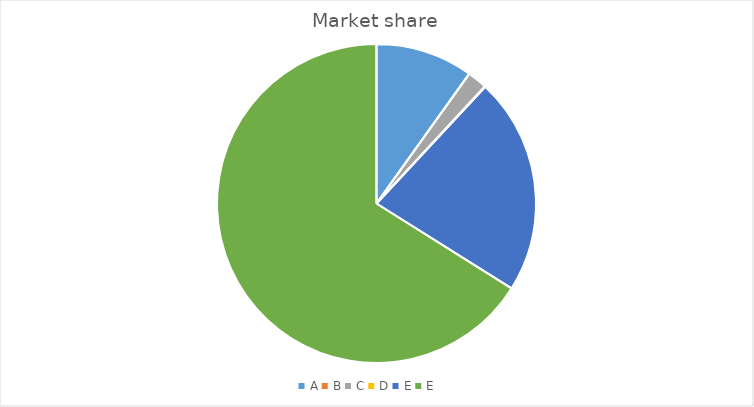
| Category | Market share |
|---|---|
| A | 0.099 |
| B | 0 |
| C | 0.02 |
| D | 0.001 |
| E | 0.22 |
| E | 0.661 |